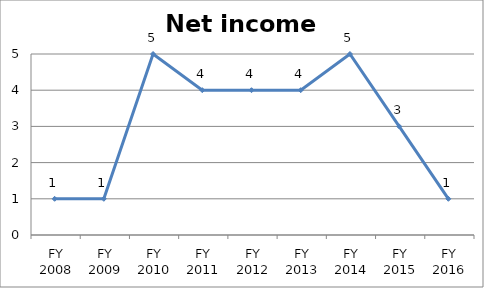
| Category | Net income score |
|---|---|
| FY 2016 | 1 |
| FY 2015 | 3 |
| FY 2014 | 5 |
| FY 2013 | 4 |
| FY 2012 | 4 |
| FY 2011 | 4 |
| FY 2010 | 5 |
| FY 2009 | 1 |
| FY 2008 | 1 |